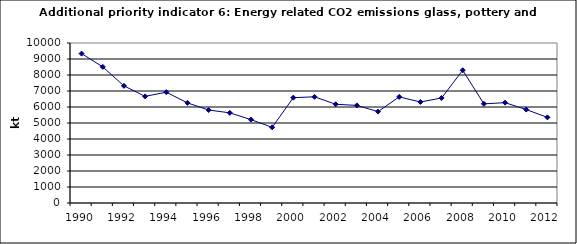
| Category | Energy related CO2 emissions from glass, pottery and building materials, kt |
|---|---|
| 1990 | 9337.221 |
| 1991 | 8506.792 |
| 1992 | 7321.926 |
| 1993 | 6664.485 |
| 1994 | 6926.224 |
| 1995 | 6256.082 |
| 1996 | 5811.301 |
| 1997 | 5634.767 |
| 1998 | 5210.203 |
| 1999 | 4729.314 |
| 2000 | 6583.12 |
| 2001 | 6637.617 |
| 2002 | 6172.296 |
| 2003 | 6099.114 |
| 2004 | 5712.21 |
| 2005 | 6632.573 |
| 2006 | 6313.762 |
| 2007 | 6561.004 |
| 2008 | 8295.715 |
| 2009 | 6196.371 |
| 2010 | 6270.548 |
| 2011 | 5838.893 |
| 2012 | 5351.114 |